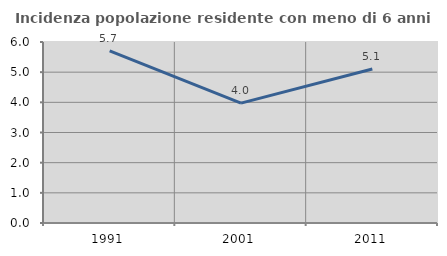
| Category | Incidenza popolazione residente con meno di 6 anni |
|---|---|
| 1991.0 | 5.709 |
| 2001.0 | 3.974 |
| 2011.0 | 5.104 |